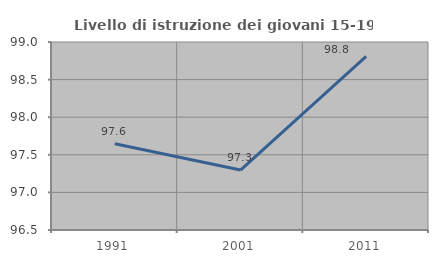
| Category | Livello di istruzione dei giovani 15-19 anni |
|---|---|
| 1991.0 | 97.647 |
| 2001.0 | 97.297 |
| 2011.0 | 98.81 |